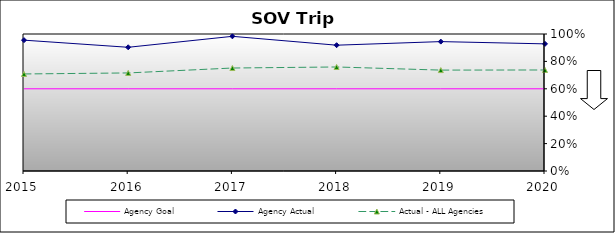
| Category | Agency Goal | Agency Actual | Actual - ALL Agencies |
|---|---|---|---|
| 2015.0 | 0.6 | 0.955 | 0.708 |
| 2016.0 | 0.6 | 0.903 | 0.716 |
| 2017.0 | 0.6 | 0.983 | 0.752 |
| 2018.0 | 0.6 | 0.918 | 0.759 |
| 2019.0 | 0.6 | 0.944 | 0.736 |
| 2020.0 | 0.6 | 0.928 | 0.737 |